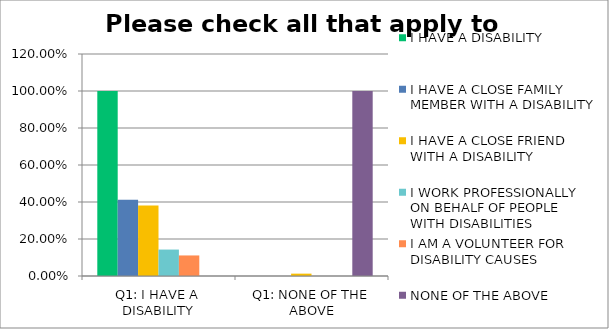
| Category | I HAVE A DISABILITY | I HAVE A CLOSE FAMILY MEMBER WITH A DISABILITY | I HAVE A CLOSE FRIEND WITH A DISABILITY | I WORK PROFESSIONALLY ON BEHALF OF PEOPLE WITH DISABILITIES | I AM A VOLUNTEER FOR DISABILITY CAUSES | NONE OF THE ABOVE |
|---|---|---|---|---|---|---|
| Q1: I HAVE A DISABILITY | 1 | 0.413 | 0.381 | 0.143 | 0.111 | 0 |
| Q1: NONE OF THE ABOVE | 0 | 0 | 0.013 | 0 | 0 | 1 |